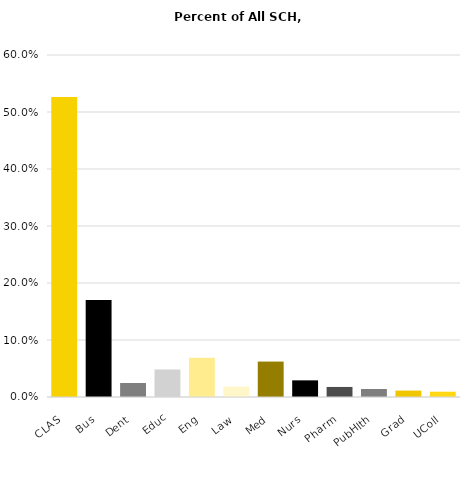
| Category | Series 0 |
|---|---|
| CLAS | 0.526 |
| Bus | 0.17 |
| Dent | 0.025 |
| Educ | 0.048 |
| Eng | 0.069 |
| Law | 0.018 |
| Med | 0.062 |
| Nurs | 0.029 |
| Pharm | 0.018 |
| PubHlth | 0.014 |
| Grad | 0.011 |
| UColl | 0.009 |